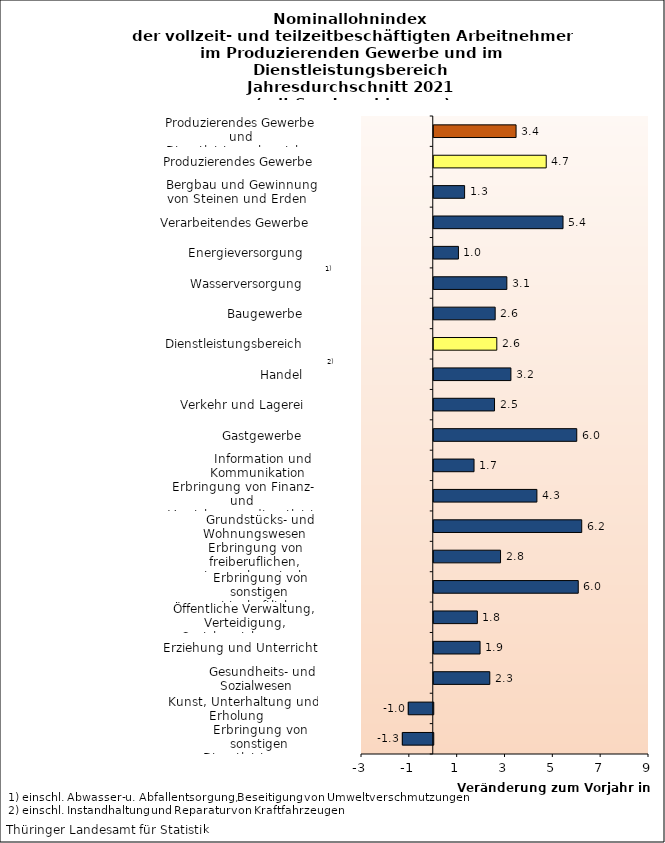
| Category | Series 0 |
|---|---|
| Erbringung von sonstigen Dienstleistungen    | -1.292 |
| Kunst, Unterhaltung und Erholung    | -1.044 |
| Gesundheits- und Sozialwesen    | 2.343 |
| Erziehung und Unterricht    | 1.937 |
| Öffentliche Verwaltung, Verteidigung, Sozialversicherung    | 1.823 |
| Erbringung von sonstigen wirtschaftlichen Dienstleistungen    | 6.042 |
| Erbringung von freiberuflichen, wissensch. u. techn. Dienstleistungen    | 2.792 |
| Grundstücks- und Wohnungswesen    | 6.187 |
| Erbringung von Finanz- und Versicherungsdienstleistungen    | 4.313 |
| Information und Kommunikation    | 1.684 |
| Gastgewerbe    | 5.979 |
| Verkehr und Lagerei    | 2.541 |
| Handel    | 3.226 |
| Dienstleistungsbereich    | 2.636 |
| Baugewerbe    | 2.568 |
| Wasserversorgung    | 3.057 |
| Energieversorgung    | 1.032 |
| Verarbeitendes Gewerbe    | 5.405 |
| Bergbau und Gewinnung von Steinen und Erden    | 1.29 |
| Produzierendes Gewerbe    | 4.703 |
| Produzierendes Gewerbe und Dienstleistungsbereich    | 3.442 |